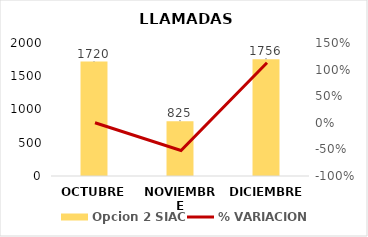
| Category | Opcion 2 SIAC |
|---|---|
| OCTUBRE | 1720 |
| NOVIEMBRE | 825 |
| DICIEMBRE | 1756 |